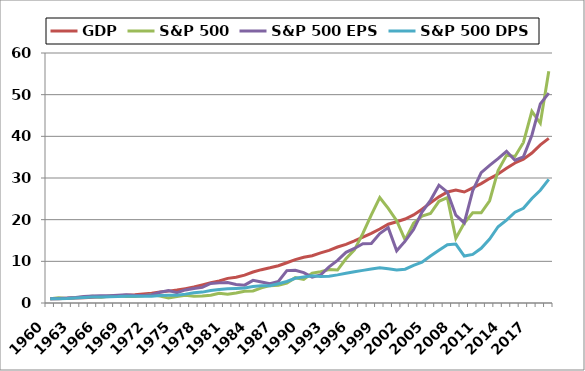
| Category | GDP | S&P 500 | S&P 500 EPS | S&P 500 DPS |
|---|---|---|---|---|
| 1960.0 | 1 | 1 | 1 | 1 |
| 1961.0 | 1.037 | 1.231 | 1.086 | 1.029 |
| 1962.0 | 1.113 | 1.086 | 1.181 | 1.083 |
| 1963.0 | 1.175 | 1.291 | 1.332 | 1.185 |
| 1964.0 | 1.262 | 1.458 | 1.535 | 1.304 |
| 1965.0 | 1.369 | 1.591 | 1.707 | 1.427 |
| 1966.0 | 1.5 | 1.382 | 1.745 | 1.455 |
| 1967.0 | 1.586 | 1.66 | 1.76 | 1.504 |
| 1968.0 | 1.734 | 1.787 | 1.844 | 1.536 |
| 1969.0 | 1.876 | 1.584 | 1.967 | 1.635 |
| 1970.0 | 1.979 | 1.586 | 1.776 | 1.609 |
| 1971.0 | 2.148 | 1.757 | 1.796 | 1.597 |
| 1972.0 | 2.358 | 2.031 | 1.99 | 1.609 |
| 1973.0 | 2.628 | 1.679 | 2.565 | 1.821 |
| 1974.0 | 2.849 | 1.18 | 3.014 | 1.879 |
| 1975.0 | 3.106 | 1.552 | 2.485 | 1.884 |
| 1976.0 | 3.454 | 1.849 | 3.141 | 2.131 |
| 1977.0 | 3.838 | 1.637 | 3.503 | 2.452 |
| 1978.0 | 4.336 | 1.654 | 3.751 | 2.614 |
| 1979.0 | 4.844 | 1.858 | 4.689 | 3.012 |
| 1980.0 | 5.268 | 2.336 | 4.83 | 3.247 |
| 1981.0 | 5.913 | 2.109 | 4.893 | 3.445 |
| 1982.0 | 6.165 | 2.42 | 4.455 | 3.499 |
| 1983.0 | 6.7 | 2.838 | 4.284 | 3.596 |
| 1984.0 | 7.444 | 2.878 | 5.427 | 3.95 |
| 1985.0 | 8 | 3.636 | 5.052 | 4.137 |
| 1986.0 | 8.444 | 4.167 | 4.651 | 4.131 |
| 1987.0 | 8.952 | 4.252 | 5.168 | 4.626 |
| 1988.0 | 9.655 | 4.779 | 7.773 | 5.158 |
| 1989.0 | 10.401 | 6.082 | 7.837 | 5.921 |
| 1990.0 | 10.994 | 5.683 | 7.299 | 6.233 |
| 1991.0 | 11.354 | 7.178 | 6.22 | 6.546 |
| 1992.0 | 12.022 | 7.498 | 6.726 | 6.377 |
| 1993.0 | 12.645 | 8.027 | 8.669 | 6.403 |
| 1994.0 | 13.436 | 7.903 | 10.232 | 6.745 |
| 1995.0 | 14.086 | 10.599 | 12.149 | 7.149 |
| 1996.0 | 14.885 | 12.747 | 13.093 | 7.514 |
| 1997.0 | 15.815 | 16.7 | 14.208 | 7.833 |
| 1998.0 | 16.709 | 21.154 | 14.266 | 8.175 |
| 1999.0 | 17.756 | 25.284 | 16.654 | 8.434 |
| 2000.0 | 18.902 | 22.72 | 18.089 | 8.21 |
| 2001.0 | 19.51 | 19.757 | 12.52 | 7.944 |
| 2002.0 | 20.164 | 15.141 | 14.837 | 8.115 |
| 2003.0 | 21.126 | 19.135 | 17.624 | 9.023 |
| 2004.0 | 22.519 | 20.856 | 21.811 | 9.794 |
| 2005.0 | 24.036 | 21.482 | 24.637 | 11.294 |
| 2006.0 | 25.47 | 24.407 | 28.269 | 12.642 |
| 2007.0 | 26.645 | 25.269 | 26.599 | 13.994 |
| 2008.0 | 27.126 | 15.544 | 21.073 | 14.156 |
| 2009.0 | 26.64 | 19.189 | 19.223 | 11.259 |
| 2010.0 | 27.641 | 21.642 | 26.96 | 11.668 |
| 2011.0 | 28.656 | 21.642 | 31.275 | 13.131 |
| 2012.0 | 29.863 | 24.543 | 33.022 | 15.362 |
| 2013.0 | 30.947 | 31.808 | 34.627 | 18.309 |
| 2014.0 | 32.315 | 35.431 | 36.419 | 19.904 |
| 2015.0 | 33.601 | 35.174 | 34.263 | 21.781 |
| 2016.0 | 34.505 | 38.527 | 35.081 | 22.725 |
| 2017.0 | 35.988 | 46.009 | 40.263 | 25.097 |
| 2018.0 | 37.944 | 43.14 | 47.804 | 27.055 |
| 2019.0 | 39.506 | 55.598 | 50.361 | 29.674 |